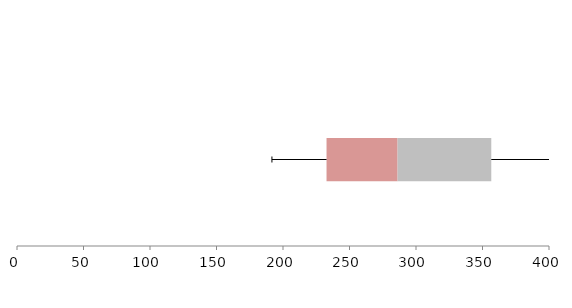
| Category | Series 1 | Series 2 | Series 3 |
|---|---|---|---|
| 0 | 232.732 | 53.421 | 70.447 |